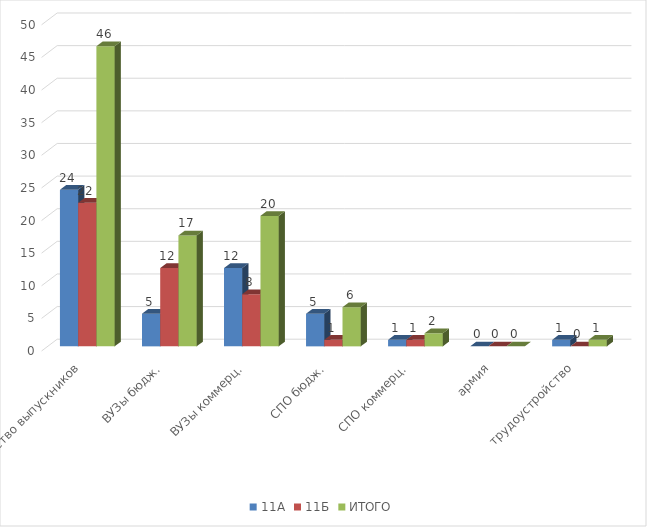
| Category | 11А | 11Б | ИТОГО |
|---|---|---|---|
| Количество выпускников | 24 | 22 | 46 |
| ВУЗы бюдж. | 5 | 12 | 17 |
| ВУЗы коммерц. | 12 | 8 | 20 |
| СПО бюдж. | 5 | 1 | 6 |
| СПО коммерц. | 1 | 1 | 2 |
| армия | 0 | 0 | 0 |
| трудоустройство | 1 | 0 | 1 |